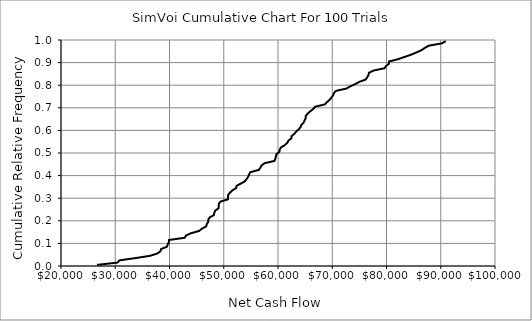
| Category | Series 0 |
|---|---|
| 26633.522325595914 | 0.005 |
| 30399.98168625337 | 0.015 |
| 30782.138242632733 | 0.025 |
| 33721.52515674997 | 0.035 |
| 36397.463767583315 | 0.045 |
| 37711.497301807656 | 0.055 |
| 38325.85133645695 | 0.065 |
| 38446.16943664757 | 0.075 |
| 39518.391990074204 | 0.085 |
| 39668.01394907492 | 0.095 |
| 39877.59826338139 | 0.105 |
| 39893.69821022398 | 0.115 |
| 42811.343717013704 | 0.125 |
| 43050.6036892064 | 0.135 |
| 43958.34105482556 | 0.145 |
| 45467.77841728845 | 0.155 |
| 45949.3432467028 | 0.165 |
| 46750.59939898617 | 0.175 |
| 46867.55294035408 | 0.185 |
| 47130.56907554706 | 0.195 |
| 47153.82297423416 | 0.205 |
| 47412.03063120171 | 0.215 |
| 48154.977217583066 | 0.225 |
| 48262.903444120406 | 0.235 |
| 48421.042627684474 | 0.245 |
| 49043.35357984937 | 0.255 |
| 49068.58371308889 | 0.265 |
| 49094.7505282223 | 0.275 |
| 49394.48321932916 | 0.285 |
| 50763.753905041885 | 0.295 |
| 50778.427713971025 | 0.305 |
| 50832.5745551164 | 0.315 |
| 51160.15559836281 | 0.325 |
| 51620.01489270308 | 0.335 |
| 52260.23134478972 | 0.345 |
| 52375.896013475955 | 0.355 |
| 53162.49106132139 | 0.365 |
| 53905.23708398311 | 0.375 |
| 54219.642747983875 | 0.385 |
| 54506.8366129497 | 0.395 |
| 54668.48657157927 | 0.405 |
| 54893.18877706429 | 0.415 |
| 56458.65201604321 | 0.425 |
| 56752.994389964195 | 0.435 |
| 56965.682830189384 | 0.445 |
| 57531.76421218569 | 0.455 |
| 59352.21812398874 | 0.465 |
| 59511.3111831608 | 0.475 |
| 59624.23058747544 | 0.485 |
| 59711.91548784729 | 0.495 |
| 60252.79794104138 | 0.505 |
| 60314.1827053593 | 0.515 |
| 60547.0956469481 | 0.525 |
| 61264.20784551128 | 0.535 |
| 61718.99473382138 | 0.545 |
| 61919.69156738762 | 0.555 |
| 62462.52936968756 | 0.565 |
| 62504.38922290401 | 0.575 |
| 63024.92257023466 | 0.585 |
| 63352.32465664006 | 0.595 |
| 63850.06819411562 | 0.605 |
| 64164.308127635755 | 0.615 |
| 64337.29943733051 | 0.625 |
| 64732.77941082179 | 0.635 |
| 64909.654327798096 | 0.645 |
| 65119.80775418579 | 0.655 |
| 65126.774458932865 | 0.665 |
| 65516.21868994972 | 0.675 |
| 65974.25845446187 | 0.685 |
| 66494.18093266759 | 0.695 |
| 66834.48184401443 | 0.705 |
| 68637.50571250387 | 0.715 |
| 69012.14545992219 | 0.725 |
| 69491.07617752672 | 0.735 |
| 69834.56499417181 | 0.745 |
| 70156.48960359007 | 0.755 |
| 70315.16078395753 | 0.765 |
| 70682.51596479409 | 0.775 |
| 72608.13298813373 | 0.785 |
| 73323.76729660372 | 0.795 |
| 74244.3059296348 | 0.805 |
| 75000.89940822551 | 0.815 |
| 76166.65208670945 | 0.825 |
| 76433.51148161334 | 0.835 |
| 76683.56462035289 | 0.845 |
| 76750.59733998531 | 0.855 |
| 77634.78412678391 | 0.865 |
| 79619.57845908559 | 0.875 |
| 79919.6168878054 | 0.885 |
| 80461.87214440771 | 0.895 |
| 80473.88928697901 | 0.905 |
| 82120.99361417707 | 0.915 |
| 83312.58172655286 | 0.925 |
| 84532.35526339684 | 0.935 |
| 85524.03185049415 | 0.945 |
| 86436.5420225312 | 0.955 |
| 87060.51842574339 | 0.965 |
| 87814.65117612609 | 0.975 |
| 90184.72702924711 | 0.985 |
| 90921.8678704726 | 0.995 |